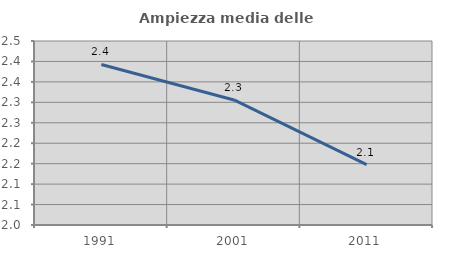
| Category | Ampiezza media delle famiglie |
|---|---|
| 1991.0 | 2.393 |
| 2001.0 | 2.306 |
| 2011.0 | 2.147 |